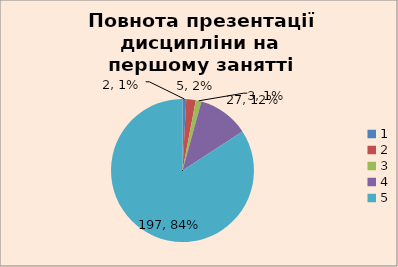
| Category | Кількість | % |
|---|---|---|
| 0 | 2 | 0.009 |
| 1 | 5 | 0.021 |
| 2 | 3 | 0.013 |
| 3 | 27 | 0.115 |
| 4 | 197 | 0.842 |